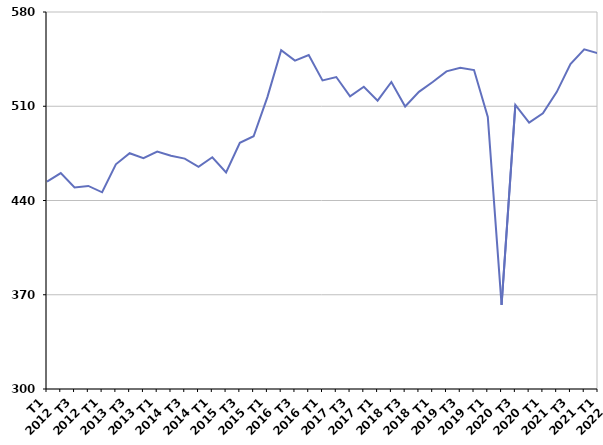
| Category | Ensemble des sorties de catégories A, B, C |
|---|---|
| T1
2012 | 454 |
| T2
2012 | 460.4 |
| T3
2012 | 449.7 |
| T4
2012 | 450.8 |
| T1
2013 | 446.1 |
| T2
2013 | 466.9 |
| T3
2013 | 475.1 |
| T4
2013 | 471.4 |
| T1
2014 | 476.4 |
| T2
2014 | 473.2 |
| T3
2014 | 471.1 |
| T4
2014 | 465 |
| T1
2015 | 472.1 |
| T2
2015 | 460.9 |
| T3
2015 | 482.9 |
| T4
2015 | 487.7 |
| T1
2016 | 516.8 |
| T2
2016 | 551.6 |
| T3
2016 | 543.9 |
| T4
2016 | 548 |
| T1
2017 | 529.2 |
| T2
2017 | 531.7 |
| T3
2017 | 517.3 |
| T4
2017 | 524.5 |
| T1
2018 | 514.2 |
| T2
2018 | 528 |
| T3
2018 | 509.8 |
| T4
2018 | 520.7 |
| T1
2019 | 528 |
| T2
2019 | 535.9 |
| T3
2019 | 538.5 |
| T4
2019 | 536.9 |
| T1
2020 | 502.1 |
| T2
2020 | 362.5 |
| T3
2020 | 511 |
| T4
2020 | 497.9 |
| T1
2021 | 504.7 |
| T2
2021 | 520.5 |
| T3
2021 | 541.4 |
| T4
2021 | 552.3 |
| T1
2022 | 549.3 |